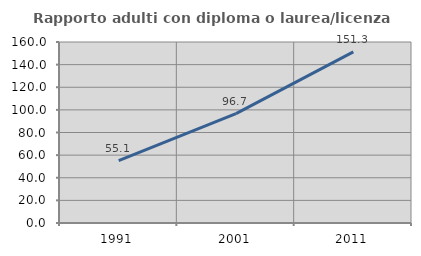
| Category | Rapporto adulti con diploma o laurea/licenza media  |
|---|---|
| 1991.0 | 55.093 |
| 2001.0 | 96.708 |
| 2011.0 | 151.282 |